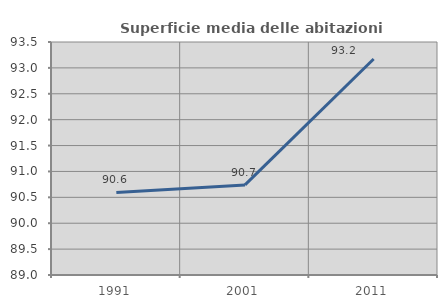
| Category | Superficie media delle abitazioni occupate |
|---|---|
| 1991.0 | 90.594 |
| 2001.0 | 90.74 |
| 2011.0 | 93.172 |